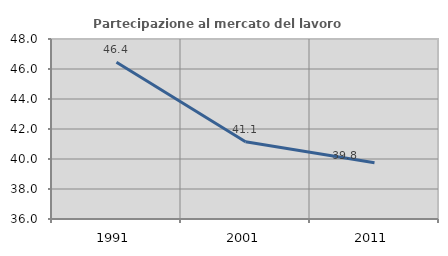
| Category | Partecipazione al mercato del lavoro  femminile |
|---|---|
| 1991.0 | 46.447 |
| 2001.0 | 41.149 |
| 2011.0 | 39.757 |